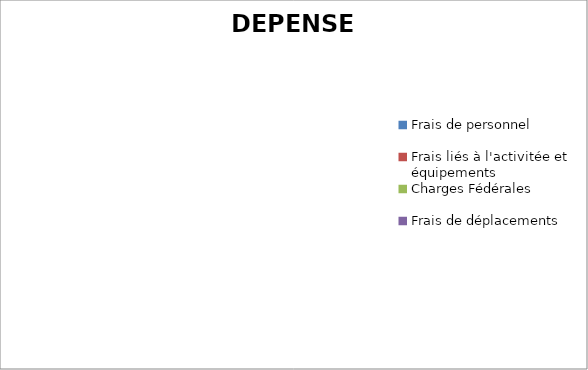
| Category | Series 0 |
|---|---|
| Frais de personnel | 0 |
| Frais liés à l'activitée et équipements | 0 |
| Charges Fédérales | 0 |
| Frais de déplacements | 0 |